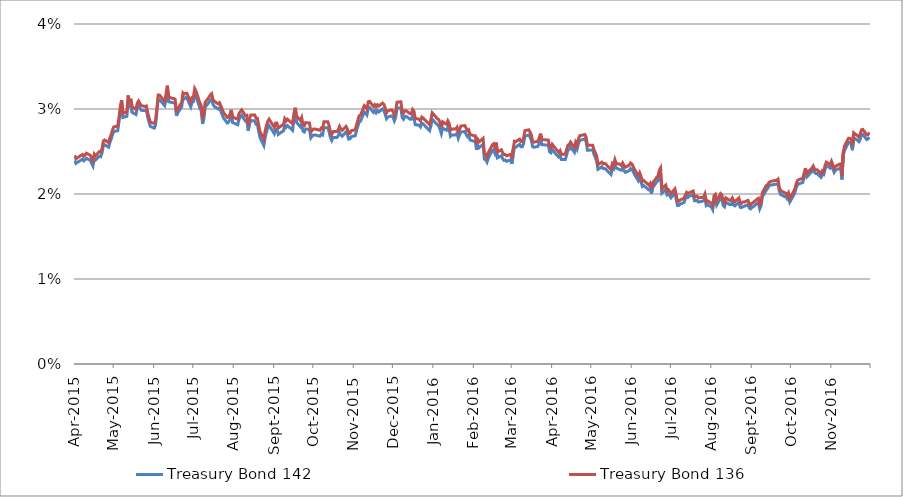
| Category | Treasury Bond 142 | Treasury Bond 136 |
|---|---|---|
| 2015-04-01 | 0.024 | 0.025 |
| 2015-04-02 | 0.024 | 0.024 |
| 2015-04-07 | 0.024 | 0.025 |
| 2015-04-08 | 0.024 | 0.024 |
| 2015-04-09 | 0.024 | 0.025 |
| 2015-04-10 | 0.024 | 0.025 |
| 2015-04-13 | 0.024 | 0.025 |
| 2015-04-14 | 0.024 | 0.024 |
| 2015-04-15 | 0.023 | 0.024 |
| 2015-04-16 | 0.024 | 0.025 |
| 2015-04-17 | 0.024 | 0.024 |
| 2015-04-20 | 0.024 | 0.025 |
| 2015-04-21 | 0.024 | 0.025 |
| 2015-04-22 | 0.025 | 0.025 |
| 2015-04-23 | 0.026 | 0.026 |
| 2015-04-24 | 0.026 | 0.026 |
| 2015-04-27 | 0.026 | 0.026 |
| 2015-04-28 | 0.026 | 0.027 |
| 2015-04-29 | 0.026 | 0.027 |
| 2015-04-30 | 0.027 | 0.028 |
| 2015-05-01 | 0.027 | 0.028 |
| 2015-05-04 | 0.027 | 0.028 |
| 2015-05-05 | 0.028 | 0.029 |
| 2015-05-06 | 0.03 | 0.03 |
| 2015-05-07 | 0.03 | 0.031 |
| 2015-05-08 | 0.029 | 0.03 |
| 2015-05-11 | 0.029 | 0.03 |
| 2015-05-12 | 0.031 | 0.032 |
| 2015-05-13 | 0.03 | 0.031 |
| 2015-05-14 | 0.031 | 0.031 |
| 2015-05-15 | 0.03 | 0.03 |
| 2015-05-18 | 0.029 | 0.03 |
| 2015-05-19 | 0.03 | 0.031 |
| 2015-05-20 | 0.03 | 0.031 |
| 2015-05-21 | 0.03 | 0.031 |
| 2015-05-22 | 0.03 | 0.03 |
| 2015-05-25 | 0.03 | 0.03 |
| 2015-05-26 | 0.03 | 0.03 |
| 2015-05-27 | 0.029 | 0.03 |
| 2015-05-28 | 0.028 | 0.029 |
| 2015-05-29 | 0.028 | 0.028 |
| 2015-06-01 | 0.028 | 0.028 |
| 2015-06-02 | 0.028 | 0.029 |
| 2015-06-03 | 0.03 | 0.03 |
| 2015-06-04 | 0.031 | 0.032 |
| 2015-06-05 | 0.031 | 0.032 |
| 2015-06-09 | 0.03 | 0.031 |
| 2015-06-10 | 0.031 | 0.032 |
| 2015-06-11 | 0.032 | 0.033 |
| 2015-06-12 | 0.031 | 0.031 |
| 2015-06-15 | 0.031 | 0.031 |
| 2015-06-16 | 0.031 | 0.031 |
| 2015-06-17 | 0.031 | 0.031 |
| 2015-06-18 | 0.029 | 0.03 |
| 2015-06-19 | 0.03 | 0.03 |
| 2015-06-22 | 0.03 | 0.031 |
| 2015-06-23 | 0.031 | 0.032 |
| 2015-06-24 | 0.031 | 0.032 |
| 2015-06-25 | 0.031 | 0.032 |
| 2015-06-26 | 0.031 | 0.032 |
| 2015-06-29 | 0.03 | 0.031 |
| 2015-06-30 | 0.031 | 0.031 |
| 2015-07-01 | 0.031 | 0.031 |
| 2015-07-02 | 0.032 | 0.032 |
| 2015-07-03 | 0.031 | 0.032 |
| 2015-07-06 | 0.03 | 0.031 |
| 2015-07-07 | 0.03 | 0.03 |
| 2015-07-08 | 0.028 | 0.029 |
| 2015-07-09 | 0.029 | 0.029 |
| 2015-07-10 | 0.03 | 0.031 |
| 2015-07-13 | 0.031 | 0.031 |
| 2015-07-14 | 0.031 | 0.032 |
| 2015-07-15 | 0.031 | 0.032 |
| 2015-07-16 | 0.031 | 0.031 |
| 2015-07-17 | 0.03 | 0.031 |
| 2015-07-20 | 0.03 | 0.031 |
| 2015-07-21 | 0.03 | 0.031 |
| 2015-07-22 | 0.03 | 0.03 |
| 2015-07-23 | 0.029 | 0.03 |
| 2015-07-24 | 0.029 | 0.03 |
| 2015-07-27 | 0.028 | 0.029 |
| 2015-07-28 | 0.028 | 0.029 |
| 2015-07-29 | 0.029 | 0.029 |
| 2015-07-30 | 0.029 | 0.03 |
| 2015-07-31 | 0.028 | 0.029 |
| 2015-08-04 | 0.028 | 0.029 |
| 2015-08-05 | 0.029 | 0.03 |
| 2015-08-06 | 0.029 | 0.03 |
| 2015-08-07 | 0.029 | 0.03 |
| 2015-08-10 | 0.029 | 0.029 |
| 2015-08-11 | 0.029 | 0.029 |
| 2015-08-12 | 0.027 | 0.028 |
| 2015-08-13 | 0.028 | 0.029 |
| 2015-08-14 | 0.029 | 0.029 |
| 2015-08-17 | 0.029 | 0.029 |
| 2015-08-18 | 0.028 | 0.029 |
| 2015-08-19 | 0.028 | 0.029 |
| 2015-08-20 | 0.027 | 0.028 |
| 2015-08-21 | 0.027 | 0.027 |
| 2015-08-24 | 0.026 | 0.026 |
| 2015-08-25 | 0.027 | 0.027 |
| 2015-08-26 | 0.027 | 0.028 |
| 2015-08-27 | 0.028 | 0.029 |
| 2015-08-28 | 0.028 | 0.029 |
| 2015-08-31 | 0.027 | 0.028 |
| 2015-09-01 | 0.027 | 0.028 |
| 2015-09-02 | 0.028 | 0.028 |
| 2015-09-03 | 0.028 | 0.028 |
| 2015-09-04 | 0.027 | 0.028 |
| 2015-09-07 | 0.027 | 0.028 |
| 2015-09-08 | 0.027 | 0.028 |
| 2015-09-09 | 0.028 | 0.029 |
| 2015-09-10 | 0.028 | 0.029 |
| 2015-09-11 | 0.028 | 0.029 |
| 2015-09-14 | 0.028 | 0.028 |
| 2015-09-15 | 0.028 | 0.028 |
| 2015-09-16 | 0.029 | 0.029 |
| 2015-09-17 | 0.029 | 0.03 |
| 2015-09-18 | 0.028 | 0.029 |
| 2015-09-21 | 0.028 | 0.029 |
| 2015-09-22 | 0.028 | 0.029 |
| 2015-09-23 | 0.027 | 0.028 |
| 2015-09-24 | 0.027 | 0.028 |
| 2015-09-25 | 0.028 | 0.028 |
| 2015-09-28 | 0.028 | 0.028 |
| 2015-09-29 | 0.027 | 0.027 |
| 2015-09-30 | 0.027 | 0.028 |
| 2015-10-01 | 0.027 | 0.028 |
| 2015-10-02 | 0.027 | 0.028 |
| 2015-10-06 | 0.027 | 0.028 |
| 2015-10-07 | 0.027 | 0.028 |
| 2015-10-08 | 0.027 | 0.028 |
| 2015-10-09 | 0.028 | 0.028 |
| 2015-10-12 | 0.028 | 0.028 |
| 2015-10-13 | 0.027 | 0.028 |
| 2015-10-14 | 0.027 | 0.027 |
| 2015-10-15 | 0.026 | 0.027 |
| 2015-10-16 | 0.027 | 0.027 |
| 2015-10-19 | 0.027 | 0.027 |
| 2015-10-20 | 0.027 | 0.028 |
| 2015-10-21 | 0.027 | 0.028 |
| 2015-10-22 | 0.027 | 0.028 |
| 2015-10-23 | 0.027 | 0.028 |
| 2015-10-26 | 0.027 | 0.028 |
| 2015-10-27 | 0.027 | 0.028 |
| 2015-10-28 | 0.026 | 0.027 |
| 2015-10-29 | 0.026 | 0.027 |
| 2015-10-30 | 0.027 | 0.027 |
| 2015-11-02 | 0.027 | 0.028 |
| 2015-11-03 | 0.027 | 0.028 |
| 2015-11-04 | 0.028 | 0.029 |
| 2015-11-05 | 0.028 | 0.029 |
| 2015-11-06 | 0.029 | 0.029 |
| 2015-11-09 | 0.03 | 0.03 |
| 2015-11-10 | 0.03 | 0.03 |
| 2015-11-11 | 0.029 | 0.03 |
| 2015-11-12 | 0.03 | 0.031 |
| 2015-11-13 | 0.03 | 0.031 |
| 2015-11-16 | 0.03 | 0.03 |
| 2015-11-17 | 0.03 | 0.03 |
| 2015-11-18 | 0.03 | 0.03 |
| 2015-11-19 | 0.03 | 0.03 |
| 2015-11-20 | 0.03 | 0.03 |
| 2015-11-23 | 0.03 | 0.031 |
| 2015-11-24 | 0.03 | 0.031 |
| 2015-11-25 | 0.029 | 0.03 |
| 2015-11-26 | 0.029 | 0.03 |
| 2015-11-27 | 0.029 | 0.03 |
| 2015-11-30 | 0.029 | 0.03 |
| 2015-12-01 | 0.029 | 0.03 |
| 2015-12-02 | 0.029 | 0.029 |
| 2015-12-03 | 0.029 | 0.03 |
| 2015-12-04 | 0.03 | 0.031 |
| 2015-12-07 | 0.03 | 0.031 |
| 2015-12-08 | 0.029 | 0.03 |
| 2015-12-09 | 0.029 | 0.03 |
| 2015-12-10 | 0.029 | 0.03 |
| 2015-12-11 | 0.029 | 0.03 |
| 2015-12-14 | 0.029 | 0.029 |
| 2015-12-15 | 0.029 | 0.03 |
| 2015-12-16 | 0.029 | 0.03 |
| 2015-12-17 | 0.029 | 0.03 |
| 2015-12-18 | 0.028 | 0.029 |
| 2015-12-21 | 0.028 | 0.029 |
| 2015-12-22 | 0.028 | 0.029 |
| 2015-12-23 | 0.028 | 0.029 |
| 2015-12-24 | 0.028 | 0.029 |
| 2015-12-29 | 0.027 | 0.028 |
| 2015-12-30 | 0.028 | 0.029 |
| 2015-12-31 | 0.029 | 0.03 |
| 2016-01-04 | 0.028 | 0.029 |
| 2016-01-05 | 0.028 | 0.029 |
| 2016-01-06 | 0.028 | 0.028 |
| 2016-01-07 | 0.027 | 0.028 |
| 2016-01-08 | 0.028 | 0.028 |
| 2016-01-11 | 0.028 | 0.028 |
| 2016-01-12 | 0.028 | 0.029 |
| 2016-01-13 | 0.028 | 0.028 |
| 2016-01-14 | 0.027 | 0.028 |
| 2016-01-15 | 0.027 | 0.028 |
| 2016-01-18 | 0.027 | 0.028 |
| 2016-01-19 | 0.027 | 0.028 |
| 2016-01-20 | 0.027 | 0.027 |
| 2016-01-21 | 0.027 | 0.028 |
| 2016-01-22 | 0.027 | 0.028 |
| 2016-01-25 | 0.027 | 0.028 |
| 2016-01-27 | 0.027 | 0.027 |
| 2016-01-28 | 0.027 | 0.028 |
| 2016-01-29 | 0.026 | 0.027 |
| 2016-02-01 | 0.026 | 0.027 |
| 2016-02-02 | 0.026 | 0.027 |
| 2016-02-03 | 0.025 | 0.026 |
| 2016-02-04 | 0.026 | 0.026 |
| 2016-02-05 | 0.025 | 0.026 |
| 2016-02-08 | 0.026 | 0.027 |
| 2016-02-09 | 0.024 | 0.025 |
| 2016-02-10 | 0.024 | 0.025 |
| 2016-02-11 | 0.024 | 0.024 |
| 2016-02-12 | 0.024 | 0.025 |
| 2016-02-15 | 0.025 | 0.026 |
| 2016-02-16 | 0.025 | 0.026 |
| 2016-02-17 | 0.025 | 0.026 |
| 2016-02-18 | 0.025 | 0.026 |
| 2016-02-19 | 0.024 | 0.025 |
| 2016-02-22 | 0.024 | 0.025 |
| 2016-02-23 | 0.024 | 0.025 |
| 2016-02-24 | 0.024 | 0.025 |
| 2016-02-25 | 0.024 | 0.025 |
| 2016-02-26 | 0.024 | 0.024 |
| 2016-02-29 | 0.024 | 0.025 |
| 2016-03-01 | 0.024 | 0.024 |
| 2016-03-02 | 0.025 | 0.025 |
| 2016-03-03 | 0.026 | 0.026 |
| 2016-03-04 | 0.026 | 0.026 |
| 2016-03-07 | 0.026 | 0.026 |
| 2016-03-08 | 0.026 | 0.026 |
| 2016-03-09 | 0.026 | 0.026 |
| 2016-03-10 | 0.026 | 0.027 |
| 2016-03-11 | 0.027 | 0.027 |
| 2016-03-14 | 0.027 | 0.028 |
| 2016-03-15 | 0.027 | 0.027 |
| 2016-03-16 | 0.026 | 0.027 |
| 2016-03-17 | 0.026 | 0.026 |
| 2016-03-18 | 0.026 | 0.026 |
| 2016-03-21 | 0.026 | 0.026 |
| 2016-03-22 | 0.026 | 0.027 |
| 2016-03-23 | 0.026 | 0.027 |
| 2016-03-24 | 0.026 | 0.026 |
| 2016-03-29 | 0.026 | 0.026 |
| 2016-03-30 | 0.025 | 0.026 |
| 2016-03-31 | 0.025 | 0.025 |
| 2016-04-01 | 0.025 | 0.026 |
| 2016-04-04 | 0.025 | 0.025 |
| 2016-04-05 | 0.024 | 0.025 |
| 2016-04-06 | 0.024 | 0.025 |
| 2016-04-07 | 0.025 | 0.025 |
| 2016-04-08 | 0.024 | 0.025 |
| 2016-04-11 | 0.024 | 0.025 |
| 2016-04-12 | 0.025 | 0.025 |
| 2016-04-13 | 0.025 | 0.026 |
| 2016-04-14 | 0.025 | 0.026 |
| 2016-04-15 | 0.026 | 0.026 |
| 2016-04-18 | 0.025 | 0.025 |
| 2016-04-19 | 0.026 | 0.026 |
| 2016-04-20 | 0.025 | 0.026 |
| 2016-04-21 | 0.026 | 0.026 |
| 2016-04-22 | 0.026 | 0.027 |
| 2016-04-26 | 0.026 | 0.027 |
| 2016-04-27 | 0.026 | 0.027 |
| 2016-04-28 | 0.025 | 0.026 |
| 2016-04-29 | 0.025 | 0.026 |
| 2016-05-02 | 0.025 | 0.026 |
| 2016-05-03 | 0.025 | 0.025 |
| 2016-05-04 | 0.024 | 0.025 |
| 2016-05-05 | 0.024 | 0.024 |
| 2016-05-06 | 0.023 | 0.023 |
| 2016-05-09 | 0.023 | 0.024 |
| 2016-05-10 | 0.023 | 0.024 |
| 2016-05-11 | 0.023 | 0.024 |
| 2016-05-12 | 0.023 | 0.024 |
| 2016-05-13 | 0.023 | 0.023 |
| 2016-05-16 | 0.022 | 0.023 |
| 2016-05-17 | 0.023 | 0.024 |
| 2016-05-18 | 0.023 | 0.023 |
| 2016-05-19 | 0.024 | 0.024 |
| 2016-05-20 | 0.023 | 0.024 |
| 2016-05-23 | 0.023 | 0.024 |
| 2016-05-24 | 0.023 | 0.023 |
| 2016-05-25 | 0.023 | 0.024 |
| 2016-05-26 | 0.023 | 0.023 |
| 2016-05-27 | 0.023 | 0.023 |
| 2016-05-30 | 0.023 | 0.023 |
| 2016-05-31 | 0.023 | 0.024 |
| 2016-06-01 | 0.023 | 0.024 |
| 2016-06-02 | 0.023 | 0.023 |
| 2016-06-03 | 0.022 | 0.023 |
| 2016-06-06 | 0.022 | 0.022 |
| 2016-06-07 | 0.022 | 0.022 |
| 2016-06-08 | 0.022 | 0.022 |
| 2016-06-09 | 0.021 | 0.022 |
| 2016-06-10 | 0.021 | 0.022 |
| 2016-06-14 | 0.02 | 0.021 |
| 2016-06-15 | 0.021 | 0.021 |
| 2016-06-16 | 0.02 | 0.021 |
| 2016-06-17 | 0.021 | 0.021 |
| 2016-06-20 | 0.021 | 0.022 |
| 2016-06-21 | 0.022 | 0.022 |
| 2016-06-22 | 0.022 | 0.023 |
| 2016-06-23 | 0.022 | 0.023 |
| 2016-06-24 | 0.02 | 0.021 |
| 2016-06-27 | 0.021 | 0.021 |
| 2016-06-28 | 0.02 | 0.02 |
| 2016-06-29 | 0.02 | 0.02 |
| 2016-06-30 | 0.02 | 0.02 |
| 2016-07-01 | 0.02 | 0.02 |
| 2016-07-04 | 0.02 | 0.021 |
| 2016-07-05 | 0.019 | 0.02 |
| 2016-07-06 | 0.019 | 0.019 |
| 2016-07-07 | 0.019 | 0.019 |
| 2016-07-08 | 0.019 | 0.019 |
| 2016-07-11 | 0.019 | 0.02 |
| 2016-07-12 | 0.019 | 0.02 |
| 2016-07-13 | 0.02 | 0.02 |
| 2016-07-14 | 0.02 | 0.02 |
| 2016-07-15 | 0.02 | 0.02 |
| 2016-07-18 | 0.02 | 0.02 |
| 2016-07-19 | 0.019 | 0.02 |
| 2016-07-20 | 0.019 | 0.02 |
| 2016-07-21 | 0.019 | 0.02 |
| 2016-07-22 | 0.019 | 0.02 |
| 2016-07-25 | 0.019 | 0.02 |
| 2016-07-26 | 0.019 | 0.02 |
| 2016-07-27 | 0.02 | 0.02 |
| 2016-07-28 | 0.019 | 0.019 |
| 2016-07-29 | 0.019 | 0.019 |
| 2016-08-01 | 0.018 | 0.019 |
| 2016-08-02 | 0.018 | 0.019 |
| 2016-08-03 | 0.019 | 0.02 |
| 2016-08-04 | 0.019 | 0.02 |
| 2016-08-05 | 0.019 | 0.019 |
| 2016-08-08 | 0.02 | 0.02 |
| 2016-08-09 | 0.019 | 0.02 |
| 2016-08-10 | 0.019 | 0.019 |
| 2016-08-11 | 0.019 | 0.019 |
| 2016-08-12 | 0.019 | 0.02 |
| 2016-08-15 | 0.019 | 0.019 |
| 2016-08-16 | 0.019 | 0.019 |
| 2016-08-17 | 0.019 | 0.02 |
| 2016-08-18 | 0.019 | 0.019 |
| 2016-08-19 | 0.019 | 0.019 |
| 2016-08-22 | 0.019 | 0.02 |
| 2016-08-23 | 0.018 | 0.019 |
| 2016-08-24 | 0.018 | 0.019 |
| 2016-08-25 | 0.019 | 0.019 |
| 2016-08-26 | 0.019 | 0.019 |
| 2016-08-29 | 0.019 | 0.019 |
| 2016-08-30 | 0.018 | 0.019 |
| 2016-08-31 | 0.018 | 0.019 |
| 2016-09-01 | 0.018 | 0.019 |
| 2016-09-02 | 0.019 | 0.019 |
| 2016-09-05 | 0.019 | 0.019 |
| 2016-09-06 | 0.019 | 0.02 |
| 2016-09-07 | 0.018 | 0.019 |
| 2016-09-08 | 0.019 | 0.019 |
| 2016-09-09 | 0.02 | 0.02 |
| 2016-09-12 | 0.02 | 0.021 |
| 2016-09-13 | 0.021 | 0.021 |
| 2016-09-14 | 0.021 | 0.021 |
| 2016-09-15 | 0.021 | 0.021 |
| 2016-09-16 | 0.021 | 0.022 |
| 2016-09-19 | 0.021 | 0.022 |
| 2016-09-20 | 0.021 | 0.022 |
| 2016-09-21 | 0.021 | 0.022 |
| 2016-09-22 | 0.02 | 0.021 |
| 2016-09-23 | 0.02 | 0.02 |
| 2016-09-26 | 0.02 | 0.02 |
| 2016-09-27 | 0.02 | 0.02 |
| 2016-09-28 | 0.019 | 0.02 |
| 2016-09-29 | 0.02 | 0.02 |
| 2016-09-30 | 0.019 | 0.02 |
| 2016-10-03 | 0.02 | 0.02 |
| 2016-10-04 | 0.02 | 0.021 |
| 2016-10-05 | 0.021 | 0.021 |
| 2016-10-06 | 0.021 | 0.022 |
| 2016-10-07 | 0.021 | 0.022 |
| 2016-10-10 | 0.021 | 0.022 |
| 2016-10-11 | 0.022 | 0.022 |
| 2016-10-12 | 0.023 | 0.023 |
| 2016-10-13 | 0.022 | 0.022 |
| 2016-10-14 | 0.022 | 0.023 |
| 2016-10-17 | 0.023 | 0.023 |
| 2016-10-18 | 0.023 | 0.023 |
| 2016-10-19 | 0.023 | 0.023 |
| 2016-10-20 | 0.022 | 0.023 |
| 2016-10-21 | 0.022 | 0.023 |
| 2016-10-24 | 0.022 | 0.022 |
| 2016-10-25 | 0.022 | 0.023 |
| 2016-10-26 | 0.022 | 0.023 |
| 2016-10-27 | 0.023 | 0.023 |
| 2016-10-28 | 0.023 | 0.024 |
| 2016-10-31 | 0.023 | 0.023 |
| 2016-11-01 | 0.023 | 0.024 |
| 2016-11-02 | 0.023 | 0.023 |
| 2016-11-03 | 0.023 | 0.023 |
| 2016-11-04 | 0.023 | 0.023 |
| 2016-11-07 | 0.023 | 0.024 |
| 2016-11-08 | 0.023 | 0.024 |
| 2016-11-09 | 0.022 | 0.022 |
| 2016-11-10 | 0.024 | 0.025 |
| 2016-11-11 | 0.025 | 0.026 |
| 2016-11-14 | 0.026 | 0.027 |
| 2016-11-15 | 0.026 | 0.027 |
| 2016-11-16 | 0.026 | 0.026 |
| 2016-11-17 | 0.025 | 0.026 |
| 2016-11-18 | 0.027 | 0.027 |
| 2016-11-21 | 0.026 | 0.027 |
| 2016-11-22 | 0.026 | 0.027 |
| 2016-11-23 | 0.026 | 0.027 |
| 2016-11-24 | 0.027 | 0.028 |
| 2016-11-25 | 0.027 | 0.028 |
| 2016-11-28 | 0.026 | 0.027 |
| 2016-11-29 | 0.026 | 0.027 |
| 2016-11-30 | 0.027 | 0.027 |